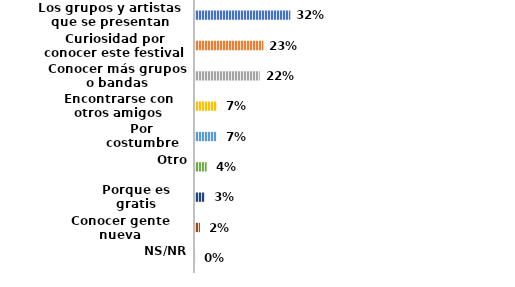
| Category | Series 0 |
|---|---|
| Los grupos y artistas que se presentan | 0.319 |
| Curiosidad por conocer este festival | 0.229 |
| Conocer más grupos o bandas | 0.217 |
| Encontrarse con otros amigos | 0.074 |
| Por costumbre | 0.072 |
| Otro | 0.039 |
| Porque es gratis | 0.033 |
| Conocer gente nueva | 0.017 |
| NS/NR | 0.002 |